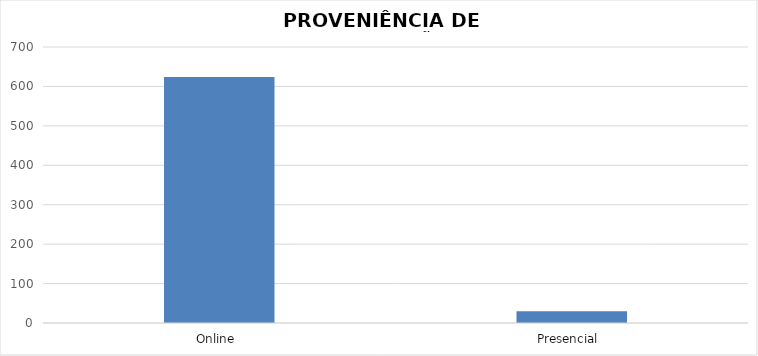
| Category | Series 0 |
|---|---|
| Online  | 624 |
| Presencial  | 30 |